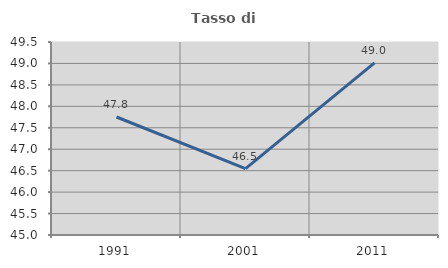
| Category | Tasso di occupazione   |
|---|---|
| 1991.0 | 47.752 |
| 2001.0 | 46.548 |
| 2011.0 | 49.012 |